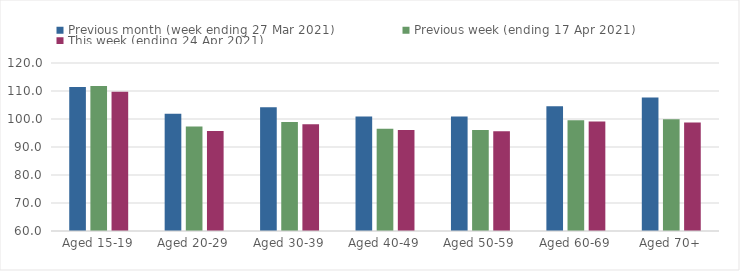
| Category | Previous month (week ending 27 Mar 2021) | Previous week (ending 17 Apr 2021) | This week (ending 24 Apr 2021) |
|---|---|---|---|
| Aged 15-19 | 111.39 | 111.82 | 109.75 |
| Aged 20-29 | 101.85 | 97.28 | 95.74 |
| Aged 30-39 | 104.18 | 98.96 | 98.12 |
| Aged 40-49 | 100.88 | 96.54 | 96.05 |
| Aged 50-59 | 100.89 | 96.08 | 95.6 |
| Aged 60-69 | 104.52 | 99.57 | 99.14 |
| Aged 70+ | 107.71 | 99.89 | 98.73 |